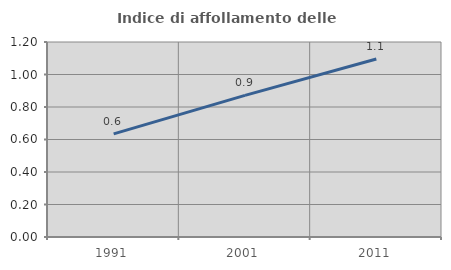
| Category | Indice di affollamento delle abitazioni  |
|---|---|
| 1991.0 | 0.635 |
| 2001.0 | 0.871 |
| 2011.0 | 1.095 |